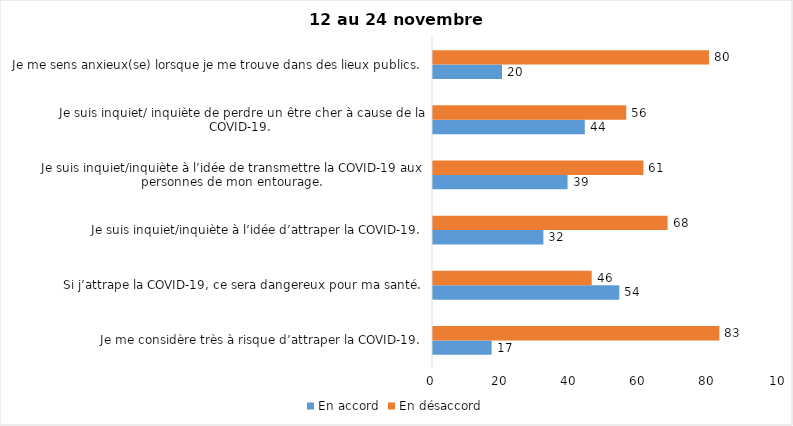
| Category | En accord | En désaccord |
|---|---|---|
| Je me considère très à risque d’attraper la COVID-19. | 17 | 83 |
| Si j’attrape la COVID-19, ce sera dangereux pour ma santé. | 54 | 46 |
| Je suis inquiet/inquiète à l’idée d’attraper la COVID-19. | 32 | 68 |
| Je suis inquiet/inquiète à l’idée de transmettre la COVID-19 aux personnes de mon entourage. | 39 | 61 |
| Je suis inquiet/ inquiète de perdre un être cher à cause de la COVID-19. | 44 | 56 |
| Je me sens anxieux(se) lorsque je me trouve dans des lieux publics. | 20 | 80 |